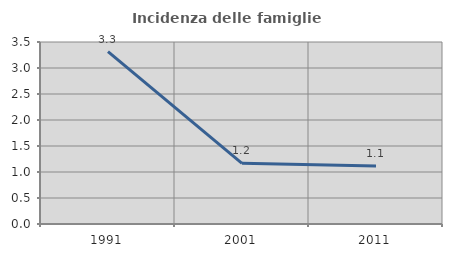
| Category | Incidenza delle famiglie numerose |
|---|---|
| 1991.0 | 3.317 |
| 2001.0 | 1.167 |
| 2011.0 | 1.116 |